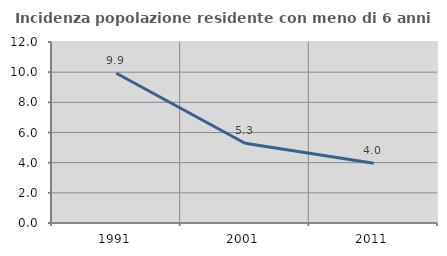
| Category | Incidenza popolazione residente con meno di 6 anni |
|---|---|
| 1991.0 | 9.925 |
| 2001.0 | 5.288 |
| 2011.0 | 3.968 |